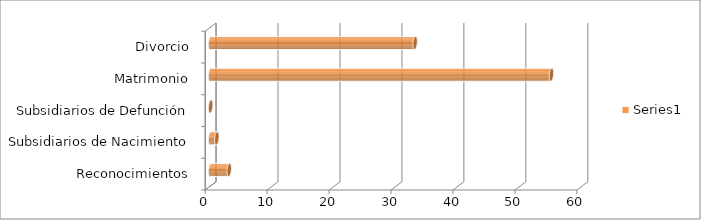
| Category | Series 0 |
|---|---|
| Reconocimientos | 3 |
| Subsidiarios de Nacimiento | 1 |
| Subsidiarios de Defunción | 0 |
| Matrimonio | 55 |
| Divorcio | 33 |